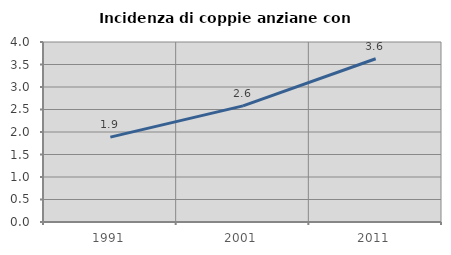
| Category | Incidenza di coppie anziane con figli |
|---|---|
| 1991.0 | 1.886 |
| 2001.0 | 2.58 |
| 2011.0 | 3.628 |